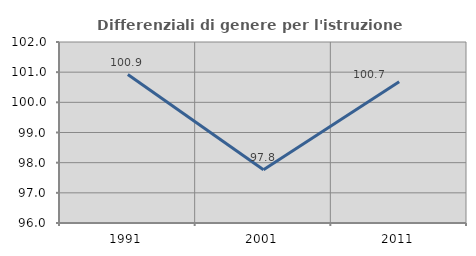
| Category | Differenziali di genere per l'istruzione superiore |
|---|---|
| 1991.0 | 100.919 |
| 2001.0 | 97.767 |
| 2011.0 | 100.684 |